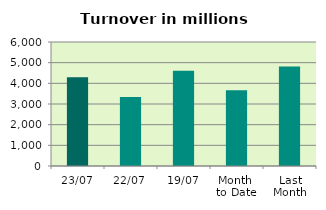
| Category | Series 0 |
|---|---|
| 23/07 | 4289.297 |
| 22/07 | 3334.744 |
| 19/07 | 4613.022 |
| Month 
to Date | 3660.47 |
| Last
Month | 4815.104 |